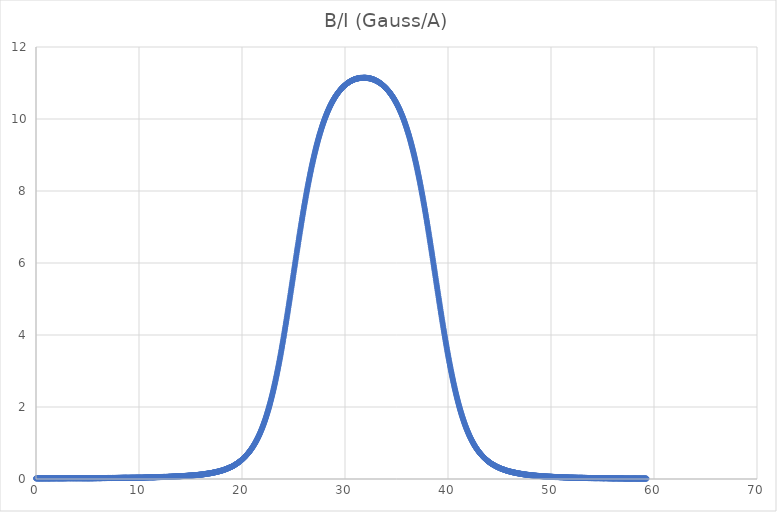
| Category | B/I (Gauss/A) |
|---|---|
| 0.0 | 0.017 |
| 0.032512 | 0.017 |
| 0.065024 | 0.018 |
| 0.097536 | 0.018 |
| 0.130048 | 0.019 |
| 0.16256 | 0.018 |
| 0.195072 | 0.019 |
| 0.227584 | 0.017 |
| 0.260096 | 0.018 |
| 0.292608 | 0.017 |
| 0.32512 | 0.017 |
| 0.357632 | 0.017 |
| 0.390144 | 0.017 |
| 0.422656 | 0.019 |
| 0.455168 | 0.019 |
| 0.48768 | 0.018 |
| 0.520192 | 0.017 |
| 0.552704 | 0.017 |
| 0.585216 | 0.017 |
| 0.617728 | 0.018 |
| 0.65024 | 0.017 |
| 0.682752 | 0.017 |
| 0.715264 | 0.017 |
| 0.747776 | 0.019 |
| 0.780288 | 0.018 |
| 0.8128 | 0.017 |
| 0.845312 | 0.018 |
| 0.877824 | 0.018 |
| 0.910336 | 0.018 |
| 0.942848 | 0.017 |
| 0.97536 | 0.017 |
| 1.007872 | 0.019 |
| 1.040384 | 0.019 |
| 1.072896 | 0.019 |
| 1.105408 | 0.017 |
| 1.13792 | 0.019 |
| 1.170432 | 0.017 |
| 1.202944 | 0.017 |
| 1.235456 | 0.018 |
| 1.267968 | 0.017 |
| 1.30048 | 0.017 |
| 1.332992 | 0.019 |
| 1.365504 | 0.017 |
| 1.398016 | 0.018 |
| 1.430528 | 0.019 |
| 1.46304 | 0.02 |
| 1.495552 | 0.019 |
| 1.528064 | 0.018 |
| 1.560576 | 0.02 |
| 1.593088 | 0.018 |
| 1.6256 | 0.019 |
| 1.658112 | 0.019 |
| 1.690624 | 0.018 |
| 1.723136 | 0.019 |
| 1.755648 | 0.018 |
| 1.78816 | 0.019 |
| 1.820672 | 0.019 |
| 1.853184 | 0.019 |
| 1.885696 | 0.02 |
| 1.918208 | 0.019 |
| 1.95072 | 0.02 |
| 1.983232 | 0.019 |
| 2.015744 | 0.02 |
| 2.048256 | 0.021 |
| 2.080768 | 0.021 |
| 2.11328 | 0.019 |
| 2.145792 | 0.018 |
| 2.178304 | 0.019 |
| 2.210816 | 0.019 |
| 2.243328 | 0.019 |
| 2.27584 | 0.019 |
| 2.308352 | 0.018 |
| 2.340864 | 0.019 |
| 2.373376 | 0.019 |
| 2.405888 | 0.019 |
| 2.4384 | 0.02 |
| 2.470912 | 0.019 |
| 2.503424 | 0.019 |
| 2.535936 | 0.018 |
| 2.568448 | 0.02 |
| 2.60096 | 0.02 |
| 2.633472 | 0.017 |
| 2.665984 | 0.02 |
| 2.698496 | 0.019 |
| 2.731008 | 0.02 |
| 2.76352 | 0.02 |
| 2.796032 | 0.019 |
| 2.828544 | 0.021 |
| 2.861056 | 0.02 |
| 2.893568 | 0.02 |
| 2.92608 | 0.021 |
| 2.958592 | 0.02 |
| 2.991104 | 0.021 |
| 3.023616 | 0.021 |
| 3.056128 | 0.022 |
| 3.08864 | 0.021 |
| 3.121152 | 0.022 |
| 3.153664 | 0.022 |
| 3.186176 | 0.023 |
| 3.218688 | 0.023 |
| 3.2512 | 0.019 |
| 3.283712 | 0.022 |
| 3.316224 | 0.021 |
| 3.348736 | 0.021 |
| 3.381248 | 0.022 |
| 3.41376 | 0.021 |
| 3.446272 | 0.021 |
| 3.478784 | 0.023 |
| 3.511296 | 0.021 |
| 3.543808 | 0.021 |
| 3.57632 | 0.02 |
| 3.608832 | 0.02 |
| 3.641344 | 0.022 |
| 3.673856 | 0.021 |
| 3.706368 | 0.022 |
| 3.73888 | 0.021 |
| 3.771392 | 0.021 |
| 3.803904 | 0.021 |
| 3.836416 | 0.021 |
| 3.868928 | 0.021 |
| 3.90144 | 0.021 |
| 3.933952 | 0.021 |
| 3.966464 | 0.021 |
| 3.998976 | 0.021 |
| 4.031488 | 0.02 |
| 4.064 | 0.021 |
| 4.096512 | 0.023 |
| 4.129024 | 0.021 |
| 4.161536 | 0.022 |
| 4.194048 | 0.021 |
| 4.22656 | 0.021 |
| 4.259072 | 0.021 |
| 4.291584 | 0.021 |
| 4.324096 | 0.023 |
| 4.356608 | 0.021 |
| 4.38912 | 0.021 |
| 4.421632 | 0.021 |
| 4.454144 | 0.021 |
| 4.486656 | 0.021 |
| 4.519168 | 0.021 |
| 4.55168 | 0.021 |
| 4.584192 | 0.019 |
| 4.616704 | 0.02 |
| 4.649216 | 0.021 |
| 4.681728 | 0.02 |
| 4.71424 | 0.022 |
| 4.746752 | 0.019 |
| 4.779264 | 0.02 |
| 4.811776 | 0.021 |
| 4.844288 | 0.021 |
| 4.8768 | 0.02 |
| 4.909312 | 0.02 |
| 4.941824 | 0.021 |
| 4.974336 | 0.019 |
| 5.006848 | 0.02 |
| 5.03936 | 0.022 |
| 5.071872 | 0.019 |
| 5.104384 | 0.019 |
| 5.136896 | 0.02 |
| 5.169408 | 0.02 |
| 5.20192 | 0.021 |
| 5.234432 | 0.021 |
| 5.266944 | 0.021 |
| 5.299456 | 0.021 |
| 5.331968 | 0.021 |
| 5.36448 | 0.02 |
| 5.396992 | 0.02 |
| 5.429504 | 0.02 |
| 5.462016 | 0.021 |
| 5.494528 | 0.022 |
| 5.52704 | 0.022 |
| 5.559552 | 0.019 |
| 5.592064 | 0.023 |
| 5.624576 | 0.02 |
| 5.657088 | 0.023 |
| 5.6896 | 0.022 |
| 5.722112 | 0.022 |
| 5.754624 | 0.023 |
| 5.787136 | 0.021 |
| 5.819648 | 0.023 |
| 5.85216 | 0.021 |
| 5.884672 | 0.023 |
| 5.917184 | 0.023 |
| 5.949696 | 0.023 |
| 5.982208 | 0.023 |
| 6.01472 | 0.024 |
| 6.047232 | 0.025 |
| 6.079744 | 0.023 |
| 6.112256 | 0.023 |
| 6.144768 | 0.023 |
| 6.17728 | 0.022 |
| 6.209792 | 0.024 |
| 6.242304 | 0.022 |
| 6.274816 | 0.023 |
| 6.307328 | 0.025 |
| 6.33984 | 0.023 |
| 6.372352 | 0.024 |
| 6.404864 | 0.024 |
| 6.437376 | 0.025 |
| 6.469888 | 0.026 |
| 6.5024 | 0.025 |
| 6.534912 | 0.026 |
| 6.567424 | 0.026 |
| 6.599936 | 0.025 |
| 6.632448 | 0.026 |
| 6.66496 | 0.024 |
| 6.697472 | 0.027 |
| 6.729984 | 0.026 |
| 6.762496 | 0.026 |
| 6.795008 | 0.025 |
| 6.82752 | 0.026 |
| 6.860032 | 0.027 |
| 6.892544 | 0.027 |
| 6.925056 | 0.028 |
| 6.957568 | 0.028 |
| 6.99008 | 0.028 |
| 7.022592 | 0.029 |
| 7.055104 | 0.028 |
| 7.087616 | 0.028 |
| 7.120128 | 0.027 |
| 7.15264 | 0.029 |
| 7.185152 | 0.028 |
| 7.217664 | 0.029 |
| 7.250176 | 0.029 |
| 7.282688 | 0.028 |
| 7.3152 | 0.027 |
| 7.347712 | 0.028 |
| 7.380224 | 0.028 |
| 7.412736 | 0.03 |
| 7.445248 | 0.029 |
| 7.47776 | 0.029 |
| 7.510272 | 0.029 |
| 7.542784 | 0.029 |
| 7.575296 | 0.028 |
| 7.607808 | 0.029 |
| 7.64032 | 0.029 |
| 7.672832 | 0.028 |
| 7.705344 | 0.029 |
| 7.737856 | 0.031 |
| 7.770368 | 0.029 |
| 7.80288 | 0.031 |
| 7.835392 | 0.031 |
| 7.867904 | 0.031 |
| 7.900416 | 0.031 |
| 7.932928 | 0.03 |
| 7.96544 | 0.032 |
| 7.997952 | 0.031 |
| 8.030464 | 0.032 |
| 8.062976 | 0.033 |
| 8.095488 | 0.031 |
| 8.128 | 0.032 |
| 8.160512 | 0.032 |
| 8.193024 | 0.033 |
| 8.225536 | 0.033 |
| 8.258048 | 0.032 |
| 8.29056 | 0.034 |
| 8.323072 | 0.033 |
| 8.355584 | 0.034 |
| 8.388096 | 0.034 |
| 8.420608 | 0.034 |
| 8.45312 | 0.034 |
| 8.485632 | 0.034 |
| 8.518144 | 0.035 |
| 8.550656 | 0.034 |
| 8.583168 | 0.036 |
| 8.61568 | 0.035 |
| 8.648192 | 0.034 |
| 8.680704 | 0.034 |
| 8.713216 | 0.037 |
| 8.745728 | 0.035 |
| 8.77824 | 0.034 |
| 8.810752 | 0.035 |
| 8.843264 | 0.034 |
| 8.875776 | 0.034 |
| 8.908288 | 0.033 |
| 8.9408 | 0.034 |
| 8.973312 | 0.034 |
| 9.005824 | 0.033 |
| 9.038336 | 0.035 |
| 9.070848 | 0.035 |
| 9.10336 | 0.035 |
| 9.135872 | 0.035 |
| 9.168384 | 0.034 |
| 9.200896 | 0.035 |
| 9.233408 | 0.036 |
| 9.26592 | 0.036 |
| 9.298432 | 0.037 |
| 9.330944 | 0.036 |
| 9.363456 | 0.036 |
| 9.395968 | 0.037 |
| 9.42848 | 0.035 |
| 9.460992 | 0.037 |
| 9.493504 | 0.036 |
| 9.526016 | 0.037 |
| 9.558528 | 0.034 |
| 9.59104 | 0.035 |
| 9.623552 | 0.038 |
| 9.656064 | 0.036 |
| 9.688576 | 0.037 |
| 9.721088 | 0.037 |
| 9.7536 | 0.039 |
| 9.786112 | 0.038 |
| 9.818624 | 0.037 |
| 9.851136 | 0.039 |
| 9.883648 | 0.036 |
| 9.91616 | 0.038 |
| 9.948672 | 0.037 |
| 9.981184 | 0.037 |
| 10.013696 | 0.037 |
| 10.046208 | 0.037 |
| 10.07872 | 0.039 |
| 10.111232 | 0.037 |
| 10.143744 | 0.037 |
| 10.176256 | 0.038 |
| 10.208768 | 0.037 |
| 10.24128 | 0.038 |
| 10.273792 | 0.035 |
| 10.306304 | 0.039 |
| 10.338816 | 0.037 |
| 10.371328 | 0.04 |
| 10.40384 | 0.039 |
| 10.436352 | 0.038 |
| 10.468864 | 0.04 |
| 10.501376 | 0.041 |
| 10.533888 | 0.041 |
| 10.5664 | 0.043 |
| 10.598912 | 0.041 |
| 10.631424 | 0.043 |
| 10.663936 | 0.044 |
| 10.696448 | 0.045 |
| 10.72896 | 0.043 |
| 10.761472 | 0.045 |
| 10.793984 | 0.046 |
| 10.826496 | 0.043 |
| 10.859008 | 0.046 |
| 10.89152 | 0.045 |
| 10.924032 | 0.046 |
| 10.956544 | 0.045 |
| 10.989056 | 0.047 |
| 11.021568 | 0.047 |
| 11.05408 | 0.046 |
| 11.086592 | 0.049 |
| 11.119104 | 0.047 |
| 11.151616 | 0.047 |
| 11.184128 | 0.047 |
| 11.21664 | 0.045 |
| 11.249152 | 0.048 |
| 11.281664 | 0.047 |
| 11.314176 | 0.047 |
| 11.346688 | 0.045 |
| 11.3792 | 0.047 |
| 11.411712 | 0.048 |
| 11.444224 | 0.046 |
| 11.476736 | 0.048 |
| 11.509248 | 0.049 |
| 11.54176 | 0.048 |
| 11.574272 | 0.05 |
| 11.606784 | 0.047 |
| 11.639296 | 0.051 |
| 11.671808 | 0.049 |
| 11.70432 | 0.052 |
| 11.736832 | 0.051 |
| 11.769344 | 0.051 |
| 11.801856 | 0.053 |
| 11.834368 | 0.051 |
| 11.86688 | 0.052 |
| 11.899392 | 0.053 |
| 11.931904 | 0.053 |
| 11.964416 | 0.053 |
| 11.996928 | 0.052 |
| 12.02944 | 0.053 |
| 12.061952 | 0.055 |
| 12.094464 | 0.054 |
| 12.126976 | 0.055 |
| 12.159488 | 0.056 |
| 12.192 | 0.055 |
| 12.224512 | 0.055 |
| 12.257024 | 0.057 |
| 12.289536 | 0.055 |
| 12.322048 | 0.057 |
| 12.35456 | 0.057 |
| 12.387072 | 0.057 |
| 12.419584 | 0.058 |
| 12.452096 | 0.059 |
| 12.484608 | 0.059 |
| 12.51712 | 0.057 |
| 12.549632 | 0.057 |
| 12.582144 | 0.057 |
| 12.614656 | 0.057 |
| 12.647168 | 0.059 |
| 12.67968 | 0.059 |
| 12.712192 | 0.059 |
| 12.744704 | 0.059 |
| 12.777216 | 0.059 |
| 12.809728 | 0.061 |
| 12.84224 | 0.06 |
| 12.874752 | 0.062 |
| 12.907264 | 0.062 |
| 12.939776 | 0.064 |
| 12.972288 | 0.063 |
| 13.0048 | 0.063 |
| 13.037312 | 0.065 |
| 13.069824 | 0.063 |
| 13.102336 | 0.065 |
| 13.134848 | 0.063 |
| 13.16736 | 0.064 |
| 13.199872 | 0.068 |
| 13.232384 | 0.067 |
| 13.264896 | 0.067 |
| 13.297408 | 0.067 |
| 13.32992 | 0.069 |
| 13.362432 | 0.069 |
| 13.394944 | 0.069 |
| 13.427456 | 0.069 |
| 13.459968 | 0.07 |
| 13.49248 | 0.071 |
| 13.524992 | 0.073 |
| 13.557504 | 0.071 |
| 13.590016 | 0.072 |
| 13.622528 | 0.073 |
| 13.65504 | 0.073 |
| 13.687552 | 0.075 |
| 13.720064 | 0.073 |
| 13.752576 | 0.074 |
| 13.785088 | 0.074 |
| 13.8176 | 0.075 |
| 13.850112 | 0.074 |
| 13.882624 | 0.075 |
| 13.915136 | 0.074 |
| 13.947648 | 0.075 |
| 13.98016 | 0.077 |
| 14.012672 | 0.077 |
| 14.045184 | 0.078 |
| 14.077696 | 0.077 |
| 14.110208 | 0.079 |
| 14.14272 | 0.08 |
| 14.175232 | 0.08 |
| 14.207744 | 0.081 |
| 14.240256 | 0.081 |
| 14.272768 | 0.082 |
| 14.30528 | 0.082 |
| 14.337792 | 0.083 |
| 14.370304 | 0.085 |
| 14.402816 | 0.083 |
| 14.435328 | 0.085 |
| 14.46784 | 0.085 |
| 14.500352 | 0.086 |
| 14.532864 | 0.086 |
| 14.565376 | 0.087 |
| 14.597888 | 0.089 |
| 14.6304 | 0.088 |
| 14.662912 | 0.089 |
| 14.695424 | 0.088 |
| 14.727936 | 0.091 |
| 14.760448 | 0.091 |
| 14.79296 | 0.093 |
| 14.825472 | 0.094 |
| 14.857984 | 0.094 |
| 14.890496 | 0.093 |
| 14.923008 | 0.095 |
| 14.95552 | 0.094 |
| 14.988032 | 0.096 |
| 15.020544 | 0.095 |
| 15.053056 | 0.098 |
| 15.085568 | 0.097 |
| 15.11808 | 0.098 |
| 15.150592 | 0.1 |
| 15.183104 | 0.099 |
| 15.215616 | 0.102 |
| 15.248128 | 0.101 |
| 15.28064 | 0.103 |
| 15.313152 | 0.103 |
| 15.345664 | 0.104 |
| 15.378176 | 0.105 |
| 15.410688 | 0.105 |
| 15.4432 | 0.108 |
| 15.475712 | 0.107 |
| 15.508224 | 0.108 |
| 15.540736 | 0.109 |
| 15.573248 | 0.109 |
| 15.60576 | 0.111 |
| 15.638272 | 0.111 |
| 15.670784 | 0.113 |
| 15.703296 | 0.113 |
| 15.735808 | 0.113 |
| 15.76832 | 0.116 |
| 15.800832 | 0.116 |
| 15.833344 | 0.118 |
| 15.865856 | 0.119 |
| 15.898368 | 0.119 |
| 15.93088 | 0.121 |
| 15.963392 | 0.119 |
| 15.995904 | 0.123 |
| 16.028416 | 0.123 |
| 16.060928 | 0.124 |
| 16.093439 | 0.125 |
| 16.125952 | 0.127 |
| 16.158464 | 0.127 |
| 16.190975 | 0.128 |
| 16.223488 | 0.131 |
| 16.256001 | 0.131 |
| 16.288511 | 0.132 |
| 16.321024 | 0.135 |
| 16.353537 | 0.134 |
| 16.386047 | 0.137 |
| 16.41856 | 0.139 |
| 16.451073 | 0.141 |
| 16.483583 | 0.143 |
| 16.516096 | 0.143 |
| 16.548609 | 0.143 |
| 16.58112 | 0.145 |
| 16.613632 | 0.147 |
| 16.646145 | 0.148 |
| 16.678656 | 0.151 |
| 16.711168 | 0.153 |
| 16.743679 | 0.153 |
| 16.776192 | 0.155 |
| 16.808704 | 0.155 |
| 16.841215 | 0.158 |
| 16.873728 | 0.158 |
| 16.90624 | 0.159 |
| 16.938751 | 0.163 |
| 16.971264 | 0.163 |
| 17.003777 | 0.165 |
| 17.036287 | 0.167 |
| 17.0688 | 0.167 |
| 17.101313 | 0.171 |
| 17.133823 | 0.172 |
| 17.166336 | 0.176 |
| 17.198849 | 0.175 |
| 17.231359 | 0.178 |
| 17.263872 | 0.181 |
| 17.296385 | 0.18 |
| 17.328896 | 0.183 |
| 17.361408 | 0.186 |
| 17.393921 | 0.189 |
| 17.426432 | 0.19 |
| 17.458944 | 0.192 |
| 17.491455 | 0.197 |
| 17.523968 | 0.197 |
| 17.55648 | 0.198 |
| 17.588991 | 0.201 |
| 17.621504 | 0.203 |
| 17.654016 | 0.207 |
| 17.686527 | 0.207 |
| 17.71904 | 0.21 |
| 17.751553 | 0.213 |
| 17.784063 | 0.214 |
| 17.816576 | 0.218 |
| 17.849089 | 0.22 |
| 17.881599 | 0.224 |
| 17.914112 | 0.223 |
| 17.946625 | 0.228 |
| 17.979136 | 0.23 |
| 18.011648 | 0.233 |
| 18.044161 | 0.235 |
| 18.076672 | 0.237 |
| 18.109184 | 0.242 |
| 18.141697 | 0.243 |
| 18.174208 | 0.248 |
| 18.20672 | 0.251 |
| 18.239231 | 0.253 |
| 18.271744 | 0.257 |
| 18.304256 | 0.26 |
| 18.336767 | 0.263 |
| 18.36928 | 0.267 |
| 18.401793 | 0.269 |
| 18.434303 | 0.275 |
| 18.466816 | 0.277 |
| 18.499329 | 0.283 |
| 18.531839 | 0.284 |
| 18.564352 | 0.289 |
| 18.596865 | 0.293 |
| 18.629375 | 0.297 |
| 18.661888 | 0.301 |
| 18.694401 | 0.305 |
| 18.726912 | 0.309 |
| 18.759424 | 0.312 |
| 18.791937 | 0.317 |
| 18.824448 | 0.322 |
| 18.85696 | 0.325 |
| 18.889471 | 0.329 |
| 18.921984 | 0.332 |
| 18.954496 | 0.337 |
| 18.987007 | 0.34 |
| 19.01952 | 0.345 |
| 19.052032 | 0.35 |
| 19.084543 | 0.355 |
| 19.117056 | 0.361 |
| 19.149569 | 0.363 |
| 19.182079 | 0.371 |
| 19.214592 | 0.377 |
| 19.247105 | 0.381 |
| 19.279615 | 0.388 |
| 19.312128 | 0.394 |
| 19.344641 | 0.4 |
| 19.377151 | 0.406 |
| 19.409664 | 0.411 |
| 19.442177 | 0.417 |
| 19.474688 | 0.423 |
| 19.5072 | 0.429 |
| 19.539713 | 0.436 |
| 19.572224 | 0.441 |
| 19.604736 | 0.449 |
| 19.637247 | 0.453 |
| 19.66976 | 0.463 |
| 19.702272 | 0.469 |
| 19.734783 | 0.477 |
| 19.767296 | 0.483 |
| 19.799809 | 0.49 |
| 19.832319 | 0.499 |
| 19.864832 | 0.504 |
| 19.897345 | 0.514 |
| 19.929855 | 0.521 |
| 19.962368 | 0.529 |
| 19.994881 | 0.536 |
| 20.027391 | 0.544 |
| 20.059904 | 0.555 |
| 20.092417 | 0.563 |
| 20.124928 | 0.571 |
| 20.15744 | 0.58 |
| 20.189953 | 0.591 |
| 20.222464 | 0.599 |
| 20.254976 | 0.607 |
| 20.287489 | 0.618 |
| 20.32 | 0.627 |
| 20.352512 | 0.638 |
| 20.385023 | 0.647 |
| 20.417536 | 0.656 |
| 20.450048 | 0.669 |
| 20.482559 | 0.678 |
| 20.515072 | 0.688 |
| 20.547585 | 0.699 |
| 20.580095 | 0.71 |
| 20.612608 | 0.721 |
| 20.645121 | 0.732 |
| 20.677631 | 0.743 |
| 20.710144 | 0.755 |
| 20.742657 | 0.768 |
| 20.775167 | 0.781 |
| 20.80768 | 0.793 |
| 20.840193 | 0.806 |
| 20.872704 | 0.817 |
| 20.905216 | 0.833 |
| 20.937729 | 0.845 |
| 20.97024 | 0.859 |
| 21.002752 | 0.873 |
| 21.035263 | 0.886 |
| 21.067776 | 0.903 |
| 21.100288 | 0.916 |
| 21.132799 | 0.933 |
| 21.165312 | 0.948 |
| 21.197824 | 0.961 |
| 21.230335 | 0.978 |
| 21.262848 | 0.995 |
| 21.295361 | 1.011 |
| 21.327871 | 1.026 |
| 21.360384 | 1.046 |
| 21.392897 | 1.062 |
| 21.425407 | 1.08 |
| 21.45792 | 1.098 |
| 21.490433 | 1.116 |
| 21.522943 | 1.135 |
| 21.555456 | 1.153 |
| 21.587969 | 1.172 |
| 21.62048 | 1.193 |
| 21.652992 | 1.212 |
| 21.685505 | 1.232 |
| 21.718016 | 1.252 |
| 21.750528 | 1.275 |
| 21.783039 | 1.295 |
| 21.815552 | 1.317 |
| 21.848064 | 1.341 |
| 21.880575 | 1.362 |
| 21.913088 | 1.385 |
| 21.945601 | 1.407 |
| 21.978111 | 1.432 |
| 22.010624 | 1.457 |
| 22.043137 | 1.479 |
| 22.075647 | 1.505 |
| 22.10816 | 1.53 |
| 22.140673 | 1.558 |
| 22.173183 | 1.585 |
| 22.205696 | 1.609 |
| 22.238209 | 1.637 |
| 22.27072 | 1.663 |
| 22.303232 | 1.695 |
| 22.335745 | 1.721 |
| 22.368256 | 1.749 |
| 22.400768 | 1.782 |
| 22.433281 | 1.81 |
| 22.465792 | 1.841 |
| 22.498304 | 1.872 |
| 22.530815 | 1.904 |
| 22.563328 | 1.935 |
| 22.59584 | 1.967 |
| 22.628351 | 2.001 |
| 22.660864 | 2.034 |
| 22.693377 | 2.069 |
| 22.725887 | 2.103 |
| 22.7584 | 2.138 |
| 22.790913 | 2.175 |
| 22.823423 | 2.209 |
| 22.855936 | 2.245 |
| 22.888449 | 2.284 |
| 22.920959 | 2.319 |
| 22.953472 | 2.357 |
| 22.985985 | 2.397 |
| 23.018496 | 2.436 |
| 23.051008 | 2.476 |
| 23.083521 | 2.516 |
| 23.116032 | 2.556 |
| 23.148544 | 2.598 |
| 23.181055 | 2.64 |
| 23.213568 | 2.681 |
| 23.24608 | 2.726 |
| 23.278591 | 2.769 |
| 23.311104 | 2.814 |
| 23.343616 | 2.855 |
| 23.376127 | 2.902 |
| 23.40864 | 2.949 |
| 23.441153 | 2.993 |
| 23.473663 | 3.04 |
| 23.506176 | 3.087 |
| 23.538689 | 3.136 |
| 23.571199 | 3.183 |
| 23.603712 | 3.231 |
| 23.636225 | 3.281 |
| 23.668736 | 3.332 |
| 23.701248 | 3.381 |
| 23.733761 | 3.429 |
| 23.766272 | 3.482 |
| 23.798784 | 3.535 |
| 23.831297 | 3.586 |
| 23.863808 | 3.639 |
| 23.89632 | 3.693 |
| 23.928831 | 3.747 |
| 23.961344 | 3.8 |
| 23.993856 | 3.854 |
| 24.026367 | 3.911 |
| 24.05888 | 3.964 |
| 24.091393 | 4.022 |
| 24.123903 | 4.077 |
| 24.156416 | 4.133 |
| 24.188929 | 4.193 |
| 24.221439 | 4.248 |
| 24.253952 | 4.307 |
| 24.286465 | 4.363 |
| 24.318975 | 4.422 |
| 24.351488 | 4.479 |
| 24.384001 | 4.537 |
| 24.416512 | 4.597 |
| 24.449024 | 4.657 |
| 24.481537 | 4.718 |
| 24.514048 | 4.776 |
| 24.54656 | 4.837 |
| 24.579073 | 4.895 |
| 24.611584 | 4.957 |
| 24.644096 | 5.017 |
| 24.676607 | 5.079 |
| 24.70912 | 5.141 |
| 24.741632 | 5.201 |
| 24.774143 | 5.263 |
| 24.806656 | 5.324 |
| 24.839169 | 5.386 |
| 24.871679 | 5.448 |
| 24.904192 | 5.511 |
| 24.936705 | 5.571 |
| 24.969215 | 5.632 |
| 25.001728 | 5.694 |
| 25.034241 | 5.757 |
| 25.066751 | 5.816 |
| 25.099264 | 5.878 |
| 25.131777 | 5.939 |
| 25.164288 | 6.003 |
| 25.1968 | 6.065 |
| 25.229313 | 6.125 |
| 25.261824 | 6.187 |
| 25.294336 | 6.246 |
| 25.326847 | 6.31 |
| 25.35936 | 6.369 |
| 25.391872 | 6.429 |
| 25.424383 | 6.489 |
| 25.456896 | 6.548 |
| 25.489408 | 6.611 |
| 25.521919 | 6.669 |
| 25.554432 | 6.73 |
| 25.586945 | 6.789 |
| 25.619455 | 6.847 |
| 25.651968 | 6.908 |
| 25.684481 | 6.963 |
| 25.716991 | 7.023 |
| 25.749504 | 7.082 |
| 25.782017 | 7.138 |
| 25.814528 | 7.195 |
| 25.84704 | 7.251 |
| 25.879553 | 7.31 |
| 25.912064 | 7.365 |
| 25.944576 | 7.421 |
| 25.977089 | 7.475 |
| 26.0096 | 7.531 |
| 26.042112 | 7.586 |
| 26.074623 | 7.637 |
| 26.107136 | 7.692 |
| 26.139648 | 7.744 |
| 26.172159 | 7.797 |
| 26.204672 | 7.851 |
| 26.237185 | 7.902 |
| 26.269695 | 7.953 |
| 26.302208 | 8.003 |
| 26.334721 | 8.054 |
| 26.367231 | 8.105 |
| 26.399744 | 8.155 |
| 26.432257 | 8.201 |
| 26.464767 | 8.251 |
| 26.49728 | 8.301 |
| 26.529793 | 8.345 |
| 26.562304 | 8.394 |
| 26.594816 | 8.44 |
| 26.627329 | 8.488 |
| 26.65984 | 8.532 |
| 26.692352 | 8.575 |
| 26.724863 | 8.622 |
| 26.757376 | 8.667 |
| 26.789888 | 8.709 |
| 26.822399 | 8.751 |
| 26.854912 | 8.791 |
| 26.887424 | 8.835 |
| 26.919935 | 8.875 |
| 26.952448 | 8.917 |
| 26.984961 | 8.956 |
| 27.017471 | 8.997 |
| 27.049984 | 9.037 |
| 27.082497 | 9.075 |
| 27.115007 | 9.113 |
| 27.14752 | 9.152 |
| 27.180033 | 9.19 |
| 27.212543 | 9.227 |
| 27.245056 | 9.263 |
| 27.277569 | 9.301 |
| 27.31008 | 9.332 |
| 27.342592 | 9.371 |
| 27.375105 | 9.405 |
| 27.407616 | 9.439 |
| 27.440128 | 9.473 |
| 27.472639 | 9.504 |
| 27.505152 | 9.538 |
| 27.537664 | 9.57 |
| 27.570175 | 9.602 |
| 27.602688 | 9.631 |
| 27.635201 | 9.663 |
| 27.667711 | 9.694 |
| 27.700224 | 9.721 |
| 27.732737 | 9.753 |
| 27.765247 | 9.78 |
| 27.79776 | 9.81 |
| 27.830273 | 9.836 |
| 27.862783 | 9.866 |
| 27.895296 | 9.892 |
| 27.927809 | 9.92 |
| 27.96032 | 9.945 |
| 27.992832 | 9.971 |
| 28.025345 | 9.997 |
| 28.057856 | 10.021 |
| 28.090368 | 10.048 |
| 28.122881 | 10.071 |
| 28.155392 | 10.093 |
| 28.187904 | 10.119 |
| 28.220415 | 10.141 |
| 28.252928 | 10.167 |
| 28.28544 | 10.185 |
| 28.317951 | 10.209 |
| 28.350464 | 10.229 |
| 28.382977 | 10.251 |
| 28.415487 | 10.273 |
| 28.448 | 10.293 |
| 28.480513 | 10.313 |
| 28.513023 | 10.335 |
| 28.545536 | 10.354 |
| 28.578049 | 10.375 |
| 28.610559 | 10.391 |
| 28.643072 | 10.411 |
| 28.675585 | 10.429 |
| 28.708096 | 10.447 |
| 28.740608 | 10.464 |
| 28.773121 | 10.481 |
| 28.805632 | 10.498 |
| 28.838144 | 10.515 |
| 28.870655 | 10.529 |
| 28.903168 | 10.545 |
| 28.93568 | 10.562 |
| 28.968191 | 10.577 |
| 29.000704 | 10.593 |
| 29.033216 | 10.61 |
| 29.065727 | 10.621 |
| 29.09824 | 10.637 |
| 29.130753 | 10.65 |
| 29.163263 | 10.665 |
| 29.195776 | 10.678 |
| 29.228289 | 10.69 |
| 29.260799 | 10.705 |
| 29.293312 | 10.716 |
| 29.325825 | 10.73 |
| 29.358335 | 10.741 |
| 29.390848 | 10.755 |
| 29.423361 | 10.766 |
| 29.455872 | 10.777 |
| 29.488384 | 10.789 |
| 29.520897 | 10.799 |
| 29.553408 | 10.811 |
| 29.58592 | 10.821 |
| 29.618431 | 10.833 |
| 29.650944 | 10.842 |
| 29.683456 | 10.852 |
| 29.715967 | 10.863 |
| 29.74848 | 10.872 |
| 29.780993 | 10.881 |
| 29.813503 | 10.89 |
| 29.846016 | 10.899 |
| 29.878529 | 10.909 |
| 29.911039 | 10.917 |
| 29.943552 | 10.926 |
| 29.976065 | 10.933 |
| 30.008575 | 10.941 |
| 30.041088 | 10.951 |
| 30.073601 | 10.956 |
| 30.106112 | 10.965 |
| 30.138624 | 10.972 |
| 30.171137 | 10.982 |
| 30.203648 | 10.986 |
| 30.23616 | 10.994 |
| 30.268673 | 10.999 |
| 30.301184 | 11.007 |
| 30.333696 | 11.013 |
| 30.366207 | 11.018 |
| 30.39872 | 11.027 |
| 30.431232 | 11.03 |
| 30.463743 | 11.038 |
| 30.496256 | 11.044 |
| 30.528769 | 11.05 |
| 30.561279 | 11.053 |
| 30.593792 | 11.059 |
| 30.626305 | 11.064 |
| 30.658815 | 11.065 |
| 30.691328 | 11.072 |
| 30.723841 | 11.077 |
| 30.756351 | 11.08 |
| 30.788864 | 11.083 |
| 30.821377 | 11.087 |
| 30.853888 | 11.095 |
| 30.8864 | 11.096 |
| 30.918913 | 11.103 |
| 30.951424 | 11.105 |
| 30.983936 | 11.108 |
| 31.016447 | 11.111 |
| 31.04896 | 11.111 |
| 31.081472 | 11.118 |
| 31.113983 | 11.117 |
| 31.146496 | 11.121 |
| 31.179008 | 11.123 |
| 31.211519 | 11.124 |
| 31.244032 | 11.128 |
| 31.276545 | 11.129 |
| 31.309055 | 11.133 |
| 31.341568 | 11.134 |
| 31.374081 | 11.135 |
| 31.406591 | 11.137 |
| 31.439104 | 11.137 |
| 31.471617 | 11.141 |
| 31.504128 | 11.139 |
| 31.53664 | 11.143 |
| 31.569153 | 11.142 |
| 31.601664 | 11.142 |
| 31.634176 | 11.141 |
| 31.666689 | 11.143 |
| 31.6992 | 11.144 |
| 31.731712 | 11.142 |
| 31.764223 | 11.145 |
| 31.796736 | 11.145 |
| 31.829248 | 11.145 |
| 31.861759 | 11.147 |
| 31.894272 | 11.146 |
| 31.926785 | 11.147 |
| 31.959295 | 11.145 |
| 31.991808 | 11.144 |
| 32.024319 | 11.145 |
| 32.056831 | 11.143 |
| 32.089344 | 11.141 |
| 32.121857 | 11.141 |
| 32.154369 | 11.141 |
| 32.186878 | 11.137 |
| 32.219391 | 11.139 |
| 32.251904 | 11.135 |
| 32.284416 | 11.135 |
| 32.316929 | 11.133 |
| 32.349442 | 11.131 |
| 32.38195 | 11.131 |
| 32.414463 | 11.128 |
| 32.446976 | 11.127 |
| 32.479488 | 11.123 |
| 32.512001 | 11.119 |
| 32.544514 | 11.118 |
| 32.577023 | 11.115 |
| 32.609535 | 11.113 |
| 32.642048 | 11.107 |
| 32.674561 | 11.105 |
| 32.707073 | 11.102 |
| 32.739586 | 11.103 |
| 32.772095 | 11.097 |
| 32.804607 | 11.093 |
| 32.83712 | 11.089 |
| 32.869633 | 11.084 |
| 32.902145 | 11.081 |
| 32.934654 | 11.076 |
| 32.967167 | 11.072 |
| 32.99968 | 11.067 |
| 33.032192 | 11.059 |
| 33.064705 | 11.058 |
| 33.097218 | 11.053 |
| 33.129726 | 11.048 |
| 33.162239 | 11.042 |
| 33.194752 | 11.037 |
| 33.227264 | 11.031 |
| 33.259777 | 11.023 |
| 33.29229 | 11.021 |
| 33.324799 | 11.015 |
| 33.357311 | 11.009 |
| 33.389824 | 11.001 |
| 33.422337 | 10.993 |
| 33.454849 | 10.989 |
| 33.487358 | 10.982 |
| 33.519871 | 10.973 |
| 33.552383 | 10.967 |
| 33.584896 | 10.962 |
| 33.617409 | 10.951 |
| 33.649921 | 10.943 |
| 33.68243 | 10.937 |
| 33.714943 | 10.926 |
| 33.747456 | 10.921 |
| 33.779968 | 10.911 |
| 33.812481 | 10.903 |
| 33.844994 | 10.893 |
| 33.877502 | 10.883 |
| 33.910015 | 10.875 |
| 33.942528 | 10.866 |
| 33.97504 | 10.859 |
| 34.007553 | 10.847 |
| 34.040066 | 10.837 |
| 34.072575 | 10.825 |
| 34.105087 | 10.815 |
| 34.1376 | 10.807 |
| 34.170113 | 10.795 |
| 34.202625 | 10.786 |
| 34.235134 | 10.774 |
| 34.267647 | 10.761 |
| 34.300159 | 10.75 |
| 34.332672 | 10.739 |
| 34.365185 | 10.727 |
| 34.397697 | 10.714 |
| 34.430206 | 10.7 |
| 34.462719 | 10.687 |
| 34.495232 | 10.673 |
| 34.527744 | 10.661 |
| 34.560257 | 10.646 |
| 34.59277 | 10.635 |
| 34.625278 | 10.619 |
| 34.657791 | 10.607 |
| 34.690304 | 10.593 |
| 34.722816 | 10.575 |
| 34.755329 | 10.561 |
| 34.787842 | 10.545 |
| 34.820351 | 10.529 |
| 34.852863 | 10.511 |
| 34.885376 | 10.496 |
| 34.917889 | 10.483 |
| 34.950401 | 10.463 |
| 34.98291 | 10.445 |
| 35.015423 | 10.427 |
| 35.047935 | 10.412 |
| 35.080448 | 10.396 |
| 35.112961 | 10.373 |
| 35.145473 | 10.356 |
| 35.177982 | 10.336 |
| 35.210495 | 10.319 |
| 35.243008 | 10.297 |
| 35.27552 | 10.276 |
| 35.308033 | 10.259 |
| 35.340546 | 10.235 |
| 35.373055 | 10.215 |
| 35.405567 | 10.191 |
| 35.43808 | 10.172 |
| 35.470592 | 10.149 |
| 35.503105 | 10.128 |
| 35.535618 | 10.103 |
| 35.568127 | 10.081 |
| 35.600639 | 10.057 |
| 35.633152 | 10.033 |
| 35.665665 | 10.007 |
| 35.698177 | 9.986 |
| 35.730686 | 9.961 |
| 35.763199 | 9.934 |
| 35.795712 | 9.907 |
| 35.828224 | 9.881 |
| 35.860737 | 9.855 |
| 35.89325 | 9.824 |
| 35.925758 | 9.8 |
| 35.958271 | 9.771 |
| 35.990784 | 9.745 |
| 36.023296 | 9.711 |
| 36.055809 | 9.681 |
| 36.088322 | 9.654 |
| 36.120831 | 9.623 |
| 36.153343 | 9.591 |
| 36.185856 | 9.562 |
| 36.218369 | 9.532 |
| 36.250881 | 9.499 |
| 36.283394 | 9.465 |
| 36.315903 | 9.432 |
| 36.348415 | 9.399 |
| 36.380928 | 9.365 |
| 36.413441 | 9.329 |
| 36.445953 | 9.293 |
| 36.478462 | 9.259 |
| 36.510975 | 9.221 |
| 36.543488 | 9.189 |
| 36.576 | 9.151 |
| 36.608513 | 9.112 |
| 36.641026 | 9.077 |
| 36.673534 | 9.037 |
| 36.706047 | 9 |
| 36.73856 | 8.959 |
| 36.771072 | 8.919 |
| 36.803585 | 8.879 |
| 36.836098 | 8.839 |
| 36.868607 | 8.797 |
| 36.901119 | 8.755 |
| 36.933632 | 8.712 |
| 36.966145 | 8.669 |
| 36.998657 | 8.626 |
| 37.03117 | 8.582 |
| 37.063679 | 8.535 |
| 37.096191 | 8.493 |
| 37.128704 | 8.447 |
| 37.161217 | 8.401 |
| 37.193729 | 8.357 |
| 37.226238 | 8.311 |
| 37.258751 | 8.265 |
| 37.291264 | 8.215 |
| 37.323776 | 8.166 |
| 37.356289 | 8.119 |
| 37.388802 | 8.067 |
| 37.42131 | 8.021 |
| 37.453823 | 7.967 |
| 37.486336 | 7.919 |
| 37.518848 | 7.869 |
| 37.551361 | 7.817 |
| 37.583874 | 7.764 |
| 37.616383 | 7.712 |
| 37.648895 | 7.661 |
| 37.681408 | 7.609 |
| 37.713921 | 7.553 |
| 37.746433 | 7.5 |
| 37.778942 | 7.447 |
| 37.811455 | 7.393 |
| 37.843967 | 7.336 |
| 37.87648 | 7.28 |
| 37.908993 | 7.226 |
| 37.941505 | 7.167 |
| 37.974014 | 7.111 |
| 38.006527 | 7.054 |
| 38.03904 | 6.997 |
| 38.071552 | 6.939 |
| 38.104065 | 6.877 |
| 38.136578 | 6.822 |
| 38.169086 | 6.763 |
| 38.201599 | 6.703 |
| 38.234112 | 6.644 |
| 38.266624 | 6.584 |
| 38.299137 | 6.523 |
| 38.33165 | 6.463 |
| 38.364159 | 6.405 |
| 38.396671 | 6.345 |
| 38.429184 | 6.284 |
| 38.461697 | 6.224 |
| 38.494209 | 6.162 |
| 38.526718 | 6.102 |
| 38.559231 | 6.043 |
| 38.591743 | 5.978 |
| 38.624256 | 5.918 |
| 38.656769 | 5.855 |
| 38.689281 | 5.795 |
| 38.72179 | 5.734 |
| 38.754303 | 5.671 |
| 38.786816 | 5.61 |
| 38.819328 | 5.548 |
| 38.851841 | 5.487 |
| 38.884354 | 5.425 |
| 38.916862 | 5.364 |
| 38.949375 | 5.304 |
| 38.981888 | 5.241 |
| 39.0144 | 5.18 |
| 39.046913 | 5.12 |
| 39.079426 | 5.059 |
| 39.111935 | 4.998 |
| 39.144447 | 4.937 |
| 39.17696 | 4.877 |
| 39.209473 | 4.815 |
| 39.241985 | 4.754 |
| 39.274494 | 4.697 |
| 39.307007 | 4.635 |
| 39.33952 | 4.58 |
| 39.372032 | 4.518 |
| 39.404545 | 4.46 |
| 39.437057 | 4.401 |
| 39.469566 | 4.344 |
| 39.502079 | 4.285 |
| 39.534592 | 4.228 |
| 39.567104 | 4.169 |
| 39.599617 | 4.115 |
| 39.63213 | 4.058 |
| 39.664639 | 4.002 |
| 39.697151 | 3.947 |
| 39.729664 | 3.892 |
| 39.762177 | 3.836 |
| 39.794689 | 3.781 |
| 39.827202 | 3.728 |
| 39.859711 | 3.676 |
| 39.892223 | 3.622 |
| 39.924736 | 3.569 |
| 39.957249 | 3.516 |
| 39.989761 | 3.467 |
| 40.02227 | 3.413 |
| 40.054783 | 3.363 |
| 40.087296 | 3.314 |
| 40.119808 | 3.264 |
| 40.152321 | 3.217 |
| 40.184834 | 3.166 |
| 40.217342 | 3.118 |
| 40.249855 | 3.069 |
| 40.282368 | 3.021 |
| 40.31488 | 2.976 |
| 40.347393 | 2.931 |
| 40.379906 | 2.885 |
| 40.412415 | 2.839 |
| 40.444927 | 2.793 |
| 40.47744 | 2.753 |
| 40.509953 | 2.706 |
| 40.542465 | 2.664 |
| 40.574978 | 2.621 |
| 40.607487 | 2.579 |
| 40.639999 | 2.538 |
| 40.672512 | 2.497 |
| 40.705025 | 2.457 |
| 40.737537 | 2.416 |
| 40.770046 | 2.378 |
| 40.802559 | 2.338 |
| 40.835072 | 2.299 |
| 40.867584 | 2.263 |
| 40.900097 | 2.227 |
| 40.93261 | 2.189 |
| 40.965118 | 2.153 |
| 40.997631 | 2.117 |
| 41.030144 | 2.081 |
| 41.062656 | 2.047 |
| 41.095169 | 2.014 |
| 41.127682 | 1.979 |
| 41.160191 | 1.945 |
| 41.192703 | 1.914 |
| 41.225216 | 1.882 |
| 41.257729 | 1.852 |
| 41.290241 | 1.821 |
| 41.322754 | 1.79 |
| 41.355263 | 1.76 |
| 41.387775 | 1.728 |
| 41.420288 | 1.701 |
| 41.452801 | 1.673 |
| 41.485313 | 1.645 |
| 41.517822 | 1.617 |
| 41.550335 | 1.589 |
| 41.582848 | 1.562 |
| 41.61536 | 1.536 |
| 41.647873 | 1.511 |
| 41.680386 | 1.483 |
| 41.712894 | 1.461 |
| 41.745407 | 1.437 |
| 41.77792 | 1.411 |
| 41.810432 | 1.388 |
| 41.842945 | 1.365 |
| 41.875458 | 1.342 |
| 41.907967 | 1.321 |
| 41.940479 | 1.297 |
| 41.972992 | 1.276 |
| 42.005505 | 1.254 |
| 42.038017 | 1.231 |
| 42.070526 | 1.21 |
| 42.103039 | 1.191 |
| 42.135551 | 1.171 |
| 42.168064 | 1.151 |
| 42.200577 | 1.132 |
| 42.233089 | 1.115 |
| 42.265598 | 1.095 |
| 42.298111 | 1.077 |
| 42.330624 | 1.059 |
| 42.363136 | 1.043 |
| 42.395649 | 1.024 |
| 42.428162 | 1.009 |
| 42.46067 | 0.991 |
| 42.493183 | 0.974 |
| 42.525696 | 0.959 |
| 42.558208 | 0.941 |
| 42.590721 | 0.927 |
| 42.623234 | 0.911 |
| 42.655743 | 0.897 |
| 42.688255 | 0.882 |
| 42.720768 | 0.867 |
| 42.753281 | 0.853 |
| 42.785793 | 0.841 |
| 42.818302 | 0.827 |
| 42.850815 | 0.813 |
| 42.883327 | 0.8 |
| 42.91584 | 0.788 |
| 42.948353 | 0.775 |
| 42.980865 | 0.763 |
| 43.013374 | 0.751 |
| 43.045887 | 0.737 |
| 43.0784 | 0.728 |
| 43.110912 | 0.713 |
| 43.143425 | 0.703 |
| 43.175938 | 0.694 |
| 43.208447 | 0.685 |
| 43.240959 | 0.672 |
| 43.273472 | 0.662 |
| 43.305984 | 0.653 |
| 43.338497 | 0.641 |
| 43.37101 | 0.632 |
| 43.403519 | 0.62 |
| 43.436031 | 0.61 |
| 43.468544 | 0.601 |
| 43.501057 | 0.593 |
| 43.533569 | 0.584 |
| 43.566078 | 0.574 |
| 43.598591 | 0.566 |
| 43.631104 | 0.558 |
| 43.663616 | 0.549 |
| 43.696129 | 0.541 |
| 43.728642 | 0.531 |
| 43.76115 | 0.525 |
| 43.793663 | 0.517 |
| 43.826176 | 0.51 |
| 43.858688 | 0.501 |
| 43.891201 | 0.491 |
| 43.923714 | 0.485 |
| 43.956223 | 0.479 |
| 43.988735 | 0.473 |
| 44.021248 | 0.465 |
| 44.053761 | 0.457 |
| 44.086273 | 0.451 |
| 44.118786 | 0.445 |
| 44.151295 | 0.439 |
| 44.183807 | 0.431 |
| 44.21632 | 0.426 |
| 44.248833 | 0.42 |
| 44.281345 | 0.413 |
| 44.313854 | 0.409 |
| 44.346367 | 0.403 |
| 44.37888 | 0.397 |
| 44.411392 | 0.391 |
| 44.443905 | 0.387 |
| 44.476418 | 0.383 |
| 44.508926 | 0.377 |
| 44.541439 | 0.371 |
| 44.573952 | 0.366 |
| 44.606464 | 0.362 |
| 44.638977 | 0.357 |
| 44.67149 | 0.349 |
| 44.703999 | 0.347 |
| 44.736511 | 0.341 |
| 44.769024 | 0.337 |
| 44.801537 | 0.332 |
| 44.834049 | 0.327 |
| 44.866562 | 0.325 |
| 44.899071 | 0.319 |
| 44.931583 | 0.315 |
| 44.964096 | 0.311 |
| 44.996609 | 0.307 |
| 45.029121 | 0.303 |
| 45.06163 | 0.298 |
| 45.094143 | 0.295 |
| 45.126656 | 0.291 |
| 45.159168 | 0.287 |
| 45.191681 | 0.284 |
| 45.224194 | 0.278 |
| 45.256702 | 0.277 |
| 45.289215 | 0.272 |
| 45.321728 | 0.27 |
| 45.35424 | 0.267 |
| 45.386753 | 0.264 |
| 45.419266 | 0.262 |
| 45.451775 | 0.257 |
| 45.484287 | 0.255 |
| 45.5168 | 0.249 |
| 45.549313 | 0.247 |
| 45.581825 | 0.244 |
| 45.614334 | 0.241 |
| 45.646847 | 0.237 |
| 45.679359 | 0.233 |
| 45.711872 | 0.231 |
| 45.744385 | 0.227 |
| 45.776897 | 0.225 |
| 45.809406 | 0.223 |
| 45.841919 | 0.221 |
| 45.874432 | 0.218 |
| 45.906944 | 0.216 |
| 45.939457 | 0.214 |
| 45.97197 | 0.21 |
| 46.004478 | 0.208 |
| 46.036991 | 0.206 |
| 46.069504 | 0.203 |
| 46.102016 | 0.201 |
| 46.134529 | 0.198 |
| 46.167042 | 0.197 |
| 46.199551 | 0.194 |
| 46.232063 | 0.191 |
| 46.264576 | 0.188 |
| 46.297089 | 0.186 |
| 46.329601 | 0.186 |
| 46.36211 | 0.183 |
| 46.394623 | 0.183 |
| 46.427135 | 0.181 |
| 46.459648 | 0.177 |
| 46.492161 | 0.177 |
| 46.524673 | 0.173 |
| 46.557182 | 0.172 |
| 46.589695 | 0.169 |
| 46.622208 | 0.168 |
| 46.65472 | 0.165 |
| 46.687233 | 0.163 |
| 46.719746 | 0.163 |
| 46.752254 | 0.159 |
| 46.784767 | 0.158 |
| 46.81728 | 0.156 |
| 46.849792 | 0.156 |
| 46.882305 | 0.153 |
| 46.914818 | 0.151 |
| 46.947327 | 0.151 |
| 46.979839 | 0.148 |
| 47.012352 | 0.145 |
| 47.044865 | 0.144 |
| 47.077377 | 0.143 |
| 47.109886 | 0.143 |
| 47.142399 | 0.139 |
| 47.174911 | 0.141 |
| 47.207424 | 0.139 |
| 47.239937 | 0.134 |
| 47.272449 | 0.134 |
| 47.304958 | 0.133 |
| 47.337471 | 0.131 |
| 47.369984 | 0.129 |
| 47.402496 | 0.129 |
| 47.435009 | 0.128 |
| 47.467522 | 0.125 |
| 47.500031 | 0.125 |
| 47.532543 | 0.124 |
| 47.565056 | 0.123 |
| 47.597569 | 0.121 |
| 47.630081 | 0.119 |
| 47.662594 | 0.117 |
| 47.695103 | 0.117 |
| 47.727615 | 0.117 |
| 47.760128 | 0.115 |
| 47.792641 | 0.114 |
| 47.825153 | 0.113 |
| 47.857662 | 0.112 |
| 47.890175 | 0.109 |
| 47.922688 | 0.109 |
| 47.9552 | 0.109 |
| 47.987713 | 0.107 |
| 48.020226 | 0.107 |
| 48.052734 | 0.105 |
| 48.085247 | 0.105 |
| 48.11776 | 0.105 |
| 48.150272 | 0.102 |
| 48.182785 | 0.103 |
| 48.215298 | 0.101 |
| 48.247807 | 0.099 |
| 48.280319 | 0.099 |
| 48.312832 | 0.097 |
| 48.345345 | 0.095 |
| 48.377857 | 0.095 |
| 48.41037 | 0.095 |
| 48.442879 | 0.094 |
| 48.475391 | 0.092 |
| 48.507904 | 0.093 |
| 48.540417 | 0.091 |
| 48.572929 | 0.091 |
| 48.605438 | 0.089 |
| 48.637951 | 0.088 |
| 48.670464 | 0.087 |
| 48.702976 | 0.087 |
| 48.735489 | 0.085 |
| 48.768002 | 0.086 |
| 48.80051 | 0.085 |
| 48.833023 | 0.083 |
| 48.865536 | 0.082 |
| 48.898048 | 0.083 |
| 48.930561 | 0.082 |
| 48.963074 | 0.079 |
| 48.995583 | 0.079 |
| 49.028095 | 0.081 |
| 49.060608 | 0.079 |
| 49.093121 | 0.078 |
| 49.125633 | 0.078 |
| 49.158146 | 0.076 |
| 49.190655 | 0.075 |
| 49.223167 | 0.074 |
| 49.25568 | 0.075 |
| 49.288193 | 0.073 |
| 49.320705 | 0.073 |
| 49.353214 | 0.071 |
| 49.385727 | 0.071 |
| 49.41824 | 0.071 |
| 49.450752 | 0.069 |
| 49.483265 | 0.071 |
| 49.515778 | 0.07 |
| 49.548286 | 0.069 |
| 49.580799 | 0.068 |
| 49.613312 | 0.068 |
| 49.645824 | 0.067 |
| 49.678337 | 0.065 |
| 49.71085 | 0.067 |
| 49.743359 | 0.064 |
| 49.775871 | 0.065 |
| 49.808384 | 0.064 |
| 49.840897 | 0.064 |
| 49.873409 | 0.066 |
| 49.905918 | 0.062 |
| 49.938431 | 0.065 |
| 49.970943 | 0.062 |
| 50.003456 | 0.063 |
| 50.035969 | 0.061 |
| 50.068481 | 0.06 |
| 50.10099 | 0.063 |
| 50.133503 | 0.059 |
| 50.166016 | 0.059 |
| 50.198528 | 0.06 |
| 50.231041 | 0.058 |
| 50.263554 | 0.056 |
| 50.296062 | 0.057 |
| 50.328575 | 0.057 |
| 50.361088 | 0.055 |
| 50.3936 | 0.055 |
| 50.426113 | 0.054 |
| 50.458626 | 0.054 |
| 50.491135 | 0.055 |
| 50.523647 | 0.054 |
| 50.55616 | 0.055 |
| 50.588673 | 0.054 |
| 50.621185 | 0.054 |
| 50.653694 | 0.054 |
| 50.686207 | 0.053 |
| 50.718719 | 0.053 |
| 50.751232 | 0.051 |
| 50.783745 | 0.052 |
| 50.816257 | 0.051 |
| 50.848766 | 0.05 |
| 50.881279 | 0.051 |
| 50.913792 | 0.049 |
| 50.946304 | 0.049 |
| 50.978817 | 0.049 |
| 51.01133 | 0.05 |
| 51.043839 | 0.049 |
| 51.076351 | 0.049 |
| 51.108864 | 0.049 |
| 51.141376 | 0.047 |
| 51.173889 | 0.048 |
| 51.206402 | 0.047 |
| 51.238911 | 0.045 |
| 51.271423 | 0.045 |
| 51.303936 | 0.044 |
| 51.336449 | 0.045 |
| 51.368961 | 0.045 |
| 51.40147 | 0.045 |
| 51.433983 | 0.044 |
| 51.466496 | 0.043 |
| 51.499008 | 0.044 |
| 51.531521 | 0.043 |
| 51.564034 | 0.043 |
| 51.596542 | 0.043 |
| 51.629055 | 0.042 |
| 51.661568 | 0.041 |
| 51.69408 | 0.041 |
| 51.726593 | 0.039 |
| 51.759106 | 0.041 |
| 51.791615 | 0.038 |
| 51.824127 | 0.039 |
| 51.85664 | 0.04 |
| 51.889153 | 0.037 |
| 51.921665 | 0.039 |
| 51.954178 | 0.039 |
| 51.986687 | 0.039 |
| 52.019199 | 0.039 |
| 52.051712 | 0.039 |
| 52.084225 | 0.039 |
| 52.116737 | 0.037 |
| 52.149246 | 0.038 |
| 52.181759 | 0.035 |
| 52.214272 | 0.037 |
| 52.246784 | 0.037 |
| 52.279297 | 0.037 |
| 52.31181 | 0.037 |
| 52.344318 | 0.035 |
| 52.376831 | 0.035 |
| 52.409344 | 0.035 |
| 52.441856 | 0.035 |
| 52.474369 | 0.037 |
| 52.506882 | 0.033 |
| 52.539391 | 0.035 |
| 52.571903 | 0.034 |
| 52.604416 | 0.034 |
| 52.636929 | 0.033 |
| 52.669441 | 0.033 |
| 52.701954 | 0.033 |
| 52.734463 | 0.033 |
| 52.766975 | 0.034 |
| 52.799488 | 0.035 |
| 52.832001 | 0.035 |
| 52.864513 | 0.033 |
| 52.897022 | 0.033 |
| 52.929535 | 0.034 |
| 52.962048 | 0.033 |
| 52.99456 | 0.035 |
| 53.027073 | 0.033 |
| 53.059586 | 0.034 |
| 53.092094 | 0.032 |
| 53.124607 | 0.031 |
| 53.15712 | 0.033 |
| 53.189632 | 0.031 |
| 53.222145 | 0.031 |
| 53.254658 | 0.032 |
| 53.287167 | 0.032 |
| 53.319679 | 0.031 |
| 53.352192 | 0.029 |
| 53.384705 | 0.031 |
| 53.417217 | 0.029 |
| 53.449726 | 0.03 |
| 53.482239 | 0.03 |
| 53.514751 | 0.027 |
| 53.547264 | 0.028 |
| 53.579777 | 0.027 |
| 53.612289 | 0.027 |
| 53.644798 | 0.026 |
| 53.677311 | 0.025 |
| 53.709824 | 0.026 |
| 53.742336 | 0.027 |
| 53.774849 | 0.025 |
| 53.807362 | 0.027 |
| 53.83987 | 0.025 |
| 53.872383 | 0.027 |
| 53.904896 | 0.026 |
| 53.937408 | 0.024 |
| 53.969921 | 0.024 |
| 54.002434 | 0.025 |
| 54.034943 | 0.025 |
| 54.067455 | 0.024 |
| 54.099968 | 0.025 |
| 54.132481 | 0.024 |
| 54.164993 | 0.025 |
| 54.197502 | 0.023 |
| 54.230015 | 0.024 |
| 54.262527 | 0.023 |
| 54.29504 | 0.025 |
| 54.327553 | 0.023 |
| 54.360065 | 0.023 |
| 54.392574 | 0.023 |
| 54.425087 | 0.023 |
| 54.4576 | 0.025 |
| 54.490112 | 0.023 |
| 54.522625 | 0.024 |
| 54.555138 | 0.023 |
| 54.587646 | 0.024 |
| 54.620159 | 0.025 |
| 54.652672 | 0.025 |
| 54.685184 | 0.023 |
| 54.717697 | 0.023 |
| 54.75021 | 0.023 |
| 54.782719 | 0.023 |
| 54.815231 | 0.02 |
| 54.847744 | 0.023 |
| 54.880257 | 0.024 |
| 54.912769 | 0.023 |
| 54.945278 | 0.023 |
| 54.977791 | 0.023 |
| 55.010303 | 0.023 |
| 55.042816 | 0.021 |
| 55.075329 | 0.021 |
| 55.107841 | 0.021 |
| 55.14035 | 0.021 |
| 55.172863 | 0.019 |
| 55.205376 | 0.021 |
| 55.237888 | 0.024 |
| 55.270401 | 0.022 |
| 55.302914 | 0.023 |
| 55.335423 | 0.022 |
| 55.367935 | 0.023 |
| 55.400448 | 0.023 |
| 55.432961 | 0.02 |
| 55.465473 | 0.022 |
| 55.497986 | 0.021 |
| 55.530495 | 0.021 |
| 55.563007 | 0.019 |
| 55.59552 | 0.021 |
| 55.628033 | 0.021 |
| 55.660545 | 0.017 |
| 55.693054 | 0.02 |
| 55.725567 | 0.019 |
| 55.75808 | 0.02 |
| 55.790592 | 0.019 |
| 55.823105 | 0.019 |
| 55.855618 | 0.02 |
| 55.888126 | 0.017 |
| 55.920639 | 0.019 |
| 55.953152 | 0.017 |
| 55.985664 | 0.018 |
| 56.018177 | 0.017 |
| 56.05069 | 0.017 |
| 56.083199 | 0.017 |
| 56.115711 | 0.017 |
| 56.148224 | 0.017 |
| 56.180737 | 0.016 |
| 56.213249 | 0.019 |
| 56.245762 | 0.019 |
| 56.278271 | 0.018 |
| 56.310783 | 0.019 |
| 56.343296 | 0.017 |
| 56.375809 | 0.018 |
| 56.408321 | 0.018 |
| 56.44083 | 0.018 |
| 56.473343 | 0.018 |
| 56.505856 | 0.015 |
| 56.538368 | 0.017 |
| 56.570881 | 0.018 |
| 56.603394 | 0.017 |
| 56.635902 | 0.017 |
| 56.668415 | 0.017 |
| 56.700928 | 0.017 |
| 56.73344 | 0.015 |
| 56.765953 | 0.017 |
| 56.798466 | 0.017 |
| 56.830975 | 0.018 |
| 56.863487 | 0.019 |
| 56.896 | 0.016 |
| 56.928513 | 0.018 |
| 56.961025 | 0.017 |
| 56.993538 | 0.016 |
| 57.026047 | 0.017 |
| 57.058559 | 0.014 |
| 57.091072 | 0.015 |
| 57.123585 | 0.013 |
| 57.156097 | 0.015 |
| 57.188606 | 0.013 |
| 57.221119 | 0.014 |
| 57.253632 | 0.013 |
| 57.286144 | 0.011 |
| 57.318657 | 0.012 |
| 57.35117 | 0.013 |
| 57.383678 | 0.013 |
| 57.416191 | 0.013 |
| 57.448704 | 0.014 |
| 57.481216 | 0.013 |
| 57.513729 | 0.013 |
| 57.546242 | 0.013 |
| 57.578751 | 0.013 |
| 57.611263 | 0.012 |
| 57.643776 | 0.013 |
| 57.676289 | 0.011 |
| 57.708801 | 0.013 |
| 57.74131 | 0.012 |
| 57.773823 | 0.013 |
| 57.806335 | 0.013 |
| 57.838848 | 0.011 |
| 57.871361 | 0.012 |
| 57.903873 | 0.011 |
| 57.936382 | 0.015 |
| 57.968895 | 0.013 |
| 58.001408 | 0.015 |
| 58.03392 | 0.014 |
| 58.066433 | 0.013 |
| 58.098946 | 0.014 |
| 58.131454 | 0.015 |
| 58.163967 | 0.014 |
| 58.19648 | 0.013 |
| 58.228992 | 0.013 |
| 58.261505 | 0.013 |
| 58.294018 | 0.013 |
| 58.326527 | 0.014 |
| 58.359039 | 0.012 |
| 58.391552 | 0.013 |
| 58.424065 | 0.011 |
| 58.456577 | 0.012 |
| 58.489086 | 0.013 |
| 58.521599 | 0.013 |
| 58.554111 | 0.013 |
| 58.586624 | 0.012 |
| 58.619137 | 0.013 |
| 58.651649 | 0.013 |
| 58.684158 | 0.011 |
| 58.716671 | 0.013 |
| 58.749184 | 0.012 |
| 58.781696 | 0.013 |
| 58.814209 | 0.011 |
| 58.846722 | 0.011 |
| 58.87923 | 0.012 |
| 58.911743 | 0.013 |
| 58.944256 | 0.013 |
| 58.976768 | 0.011 |
| 59.009281 | 0.013 |
| 59.041794 | 0.013 |
| 59.074303 | 0.012 |
| 59.106815 | 0.014 |
| 59.139328 | 0.012 |
| 59.171841 | 0.013 |
| 59.204353 | 0.011 |
| 59.236862 | 0.012 |
| 59.269375 | 0.01 |